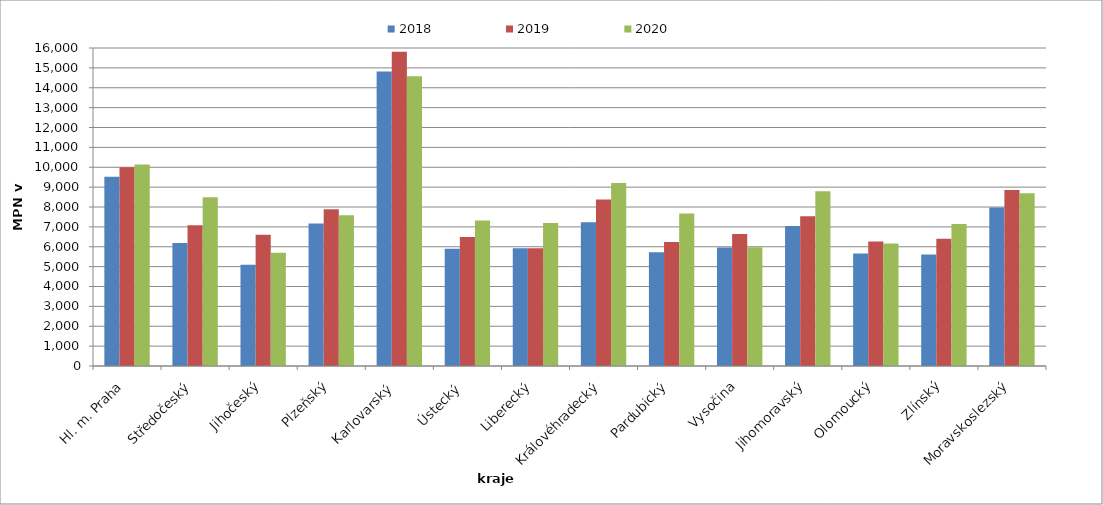
| Category | 2018 | 2019 | 2020 |
|---|---|---|---|
| Hl. m. Praha | 9528 | 10002.286 | 10140.043 |
| Středočeský | 6183.902 | 7077.522 | 8485.2 |
| Jihočeský | 5092.318 | 6601.722 | 5695.028 |
| Plzeňský | 7168.875 | 7882.5 | 7587 |
| Karlovarský  | 14813.793 | 15806.897 | 14580 |
| Ústecký   | 5905.243 | 6495.652 | 7325.064 |
| Liberecký | 5923.061 | 5923.061 | 7195.196 |
| Královéhradecký | 7234.58 | 8377.465 | 9205.72 |
| Pardubický | 5721.681 | 6238.655 | 7676.386 |
| Vysočina | 5960.301 | 6645.654 | 5975.429 |
| Jihomoravský | 7047.818 | 7531.309 | 8788.295 |
| Olomoucký | 5665.037 | 6259.92 | 6159.3 |
| Zlínský | 5613.642 | 6399.191 | 7149.711 |
| Moravskoslezský | 7980.648 | 8860.439 | 8687.415 |